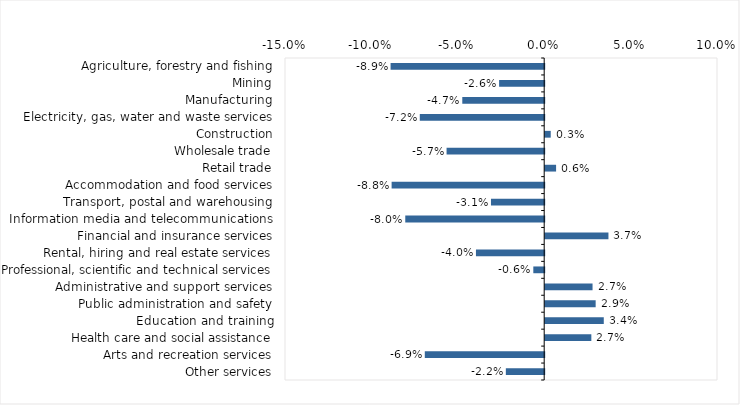
| Category | This week |
|---|---|
| Agriculture, forestry and fishing | -0.089 |
| Mining | -0.026 |
| Manufacturing | -0.047 |
| Electricity, gas, water and waste services | -0.072 |
| Construction | 0.003 |
| Wholesale trade | -0.056 |
| Retail trade | 0.006 |
| Accommodation and food services | -0.088 |
| Transport, postal and warehousing | -0.031 |
| Information media and telecommunications | -0.08 |
| Financial and insurance services | 0.037 |
| Rental, hiring and real estate services | -0.04 |
| Professional, scientific and technical services | -0.006 |
| Administrative and support services | 0.027 |
| Public administration and safety | 0.029 |
| Education and training | 0.034 |
| Health care and social assistance | 0.027 |
| Arts and recreation services | -0.069 |
| Other services | -0.022 |